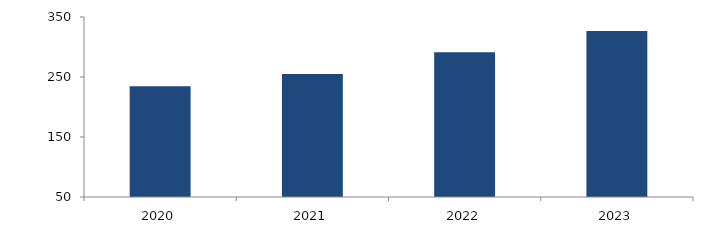
| Category | Bogotá |
|---|---|
| 2020.0 | 234.568 |
| 2021.0 | 255.108 |
| 2022.0 | 291.242 |
| 2023.0 | 326.506 |